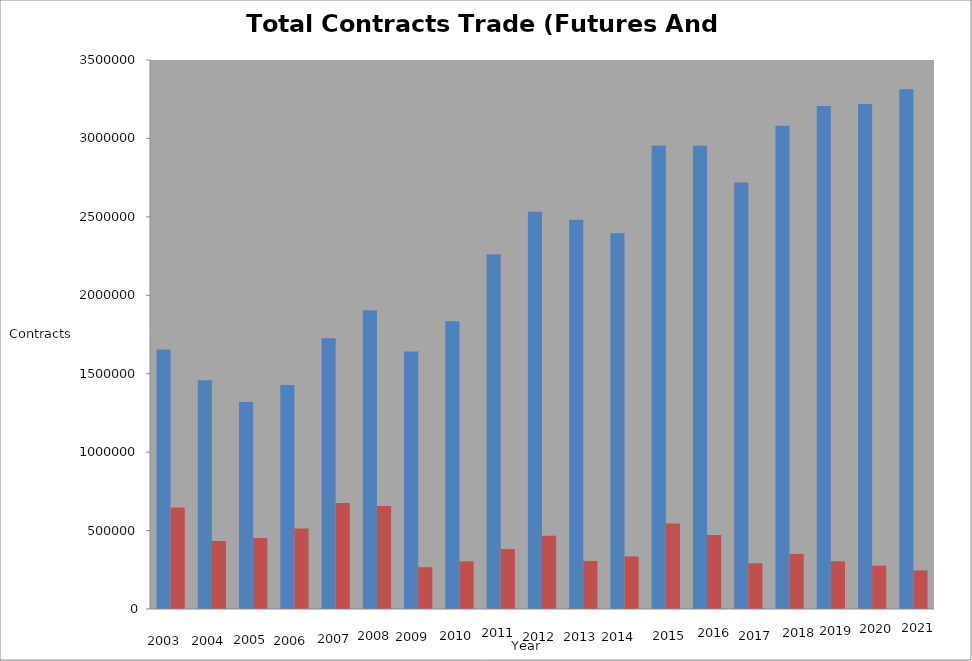
| Category | Series 0 | Series 1 |
|---|---|---|
| 0 | 1653716 | 647080 |
| 1 | 1458549 | 434266 |
| 2 | 1319585 | 451885 |
| 3 | 1427618 | 512518 |
| 4 | 1726059 | 675992 |
| 5 | 1905063 | 656819 |
| 6 | 1641842 | 266738 |
| 7 | 1835005 | 303869 |
| 8 | 2260917 | 382223 |
| 9 | 2532674 | 466770 |
| 10 | 2481627 | 306560 |
| 11 | 2395050 | 334909 |
| 12 | 2955583 | 544482 |
| 13 | 2955019 | 471061 |
| 14 | 2718489 | 291204 |
| 15 | 3080836 | 351110 |
| 16 | 3206466 | 304220 |
| 17 | 3219382 | 276216 |
| 18 | 3313674 | 246067 |